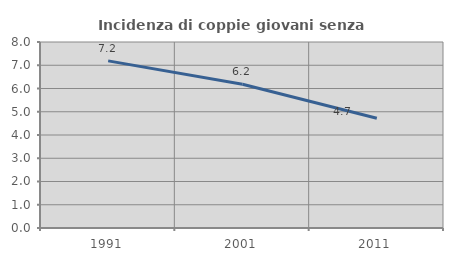
| Category | Incidenza di coppie giovani senza figli |
|---|---|
| 1991.0 | 7.188 |
| 2001.0 | 6.18 |
| 2011.0 | 4.721 |